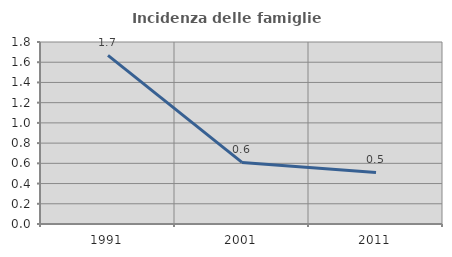
| Category | Incidenza delle famiglie numerose |
|---|---|
| 1991.0 | 1.668 |
| 2001.0 | 0.609 |
| 2011.0 | 0.51 |